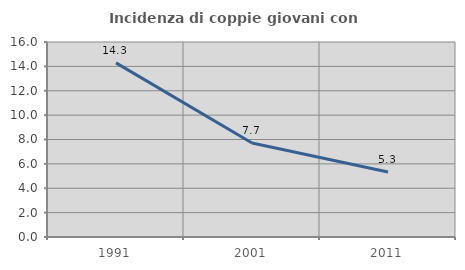
| Category | Incidenza di coppie giovani con figli |
|---|---|
| 1991.0 | 14.286 |
| 2001.0 | 7.708 |
| 2011.0 | 5.335 |